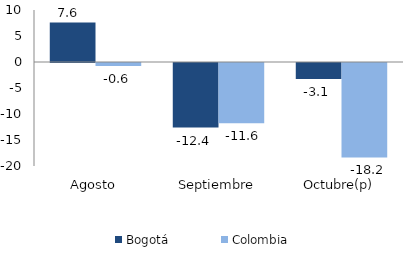
| Category | Bogotá | Colombia |
|---|---|---|
| Agosto | 7.62 | -0.556 |
| Septiembre | -12.422 | -11.595 |
| Octubre(p) | -3.094 | -18.168 |